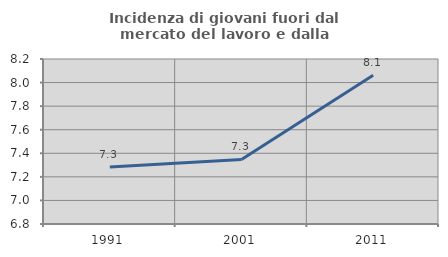
| Category | Incidenza di giovani fuori dal mercato del lavoro e dalla formazione  |
|---|---|
| 1991.0 | 7.284 |
| 2001.0 | 7.348 |
| 2011.0 | 8.062 |